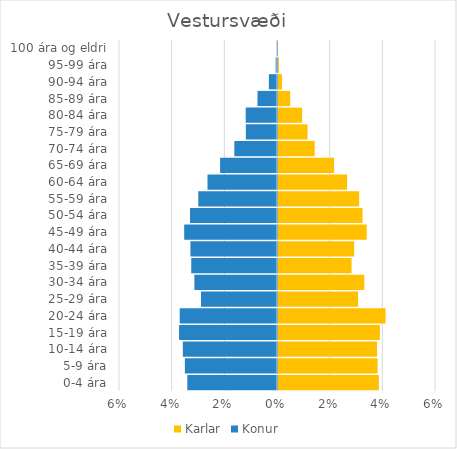
| Category | Karlar | Konur |
|---|---|---|
| 0-4 ára | 0.038 | -0.034 |
| 5-9 ára | 0.038 | -0.035 |
| 10-14 ára | 0.038 | -0.036 |
| 15-19 ára | 0.039 | -0.037 |
| 20-24 ára | 0.041 | -0.037 |
| 25-29 ára | 0.03 | -0.029 |
| 30-34 ára | 0.033 | -0.031 |
| 35-39 ára | 0.028 | -0.033 |
| 40-44 ára | 0.029 | -0.033 |
| 45-49 ára | 0.034 | -0.035 |
| 50-54 ára | 0.032 | -0.033 |
| 55-59 ára | 0.031 | -0.03 |
| 60-64 ára | 0.026 | -0.026 |
| 65-69 ára | 0.021 | -0.022 |
| 70-74 ára | 0.014 | -0.016 |
| 75-79 ára | 0.011 | -0.012 |
| 80-84 ára | 0.009 | -0.012 |
| 85-89 ára | 0.005 | -0.007 |
| 90-94 ára | 0.002 | -0.003 |
| 95-99 ára | 0 | -0.001 |
| 100 ára og eldri | 0 | 0 |